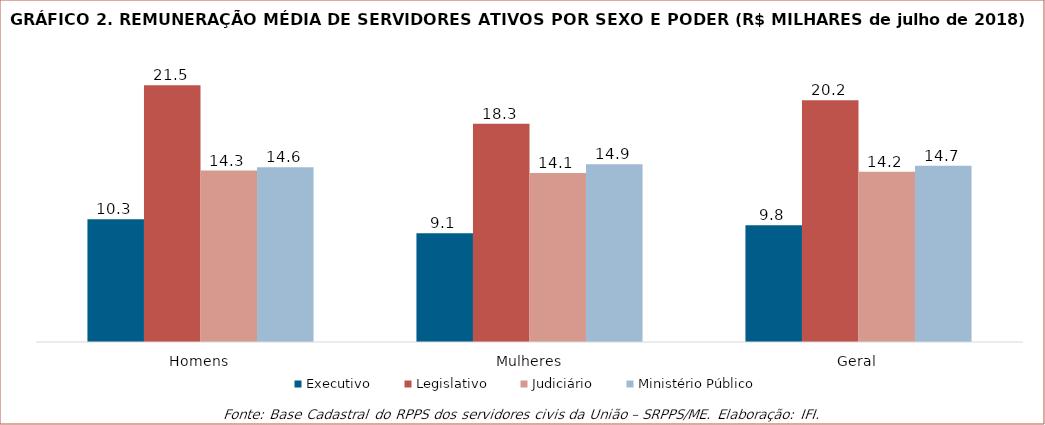
| Category | Executivo | Legislativo | Judiciário | Ministério Público |
|---|---|---|---|---|
| Homens | 10271.761 | 21468.987 | 14331.564 | 14619.39 |
| Mulheres | 9099.249 | 18251.594 | 14135.078 | 14866.331 |
| Geral | 9752.509 | 20210.5 | 14232.882 | 14726.443 |